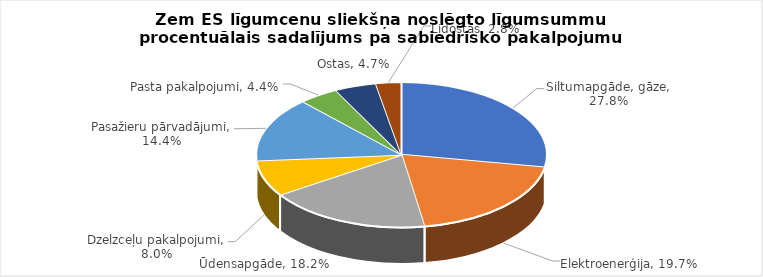
| Category | Series 0 | Series 1 |
|---|---|---|
| Siltumapgāde, gāze | 0.278 | 0.216 |
| Elektroenerģija | 0.197 | 0.321 |
| Ūdensapgāde | 0.182 | 0.175 |
| Dzelzceļu pakalpojumi | 0.08 | 0.083 |
| Pasažieru pārvadājumi | 0.144 | 0.131 |
| Pasta pakalpojumi | 0.044 | 0.001 |
| Ostas | 0.047 | 0.057 |
| Lidostas | 0.028 | 0.016 |